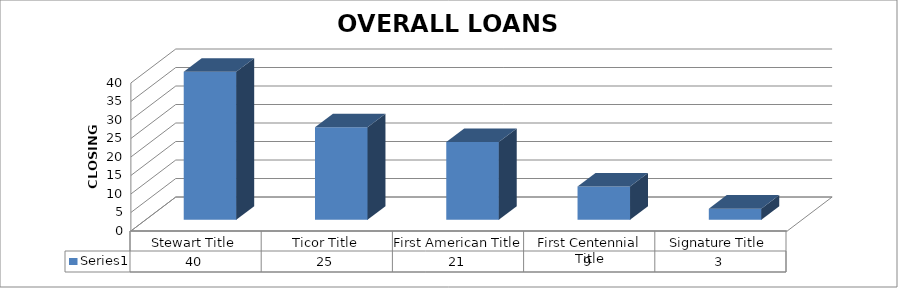
| Category | Series 0 |
|---|---|
| Stewart Title | 40 |
| Ticor Title | 25 |
| First American Title | 21 |
| First Centennial Title | 9 |
| Signature Title | 3 |